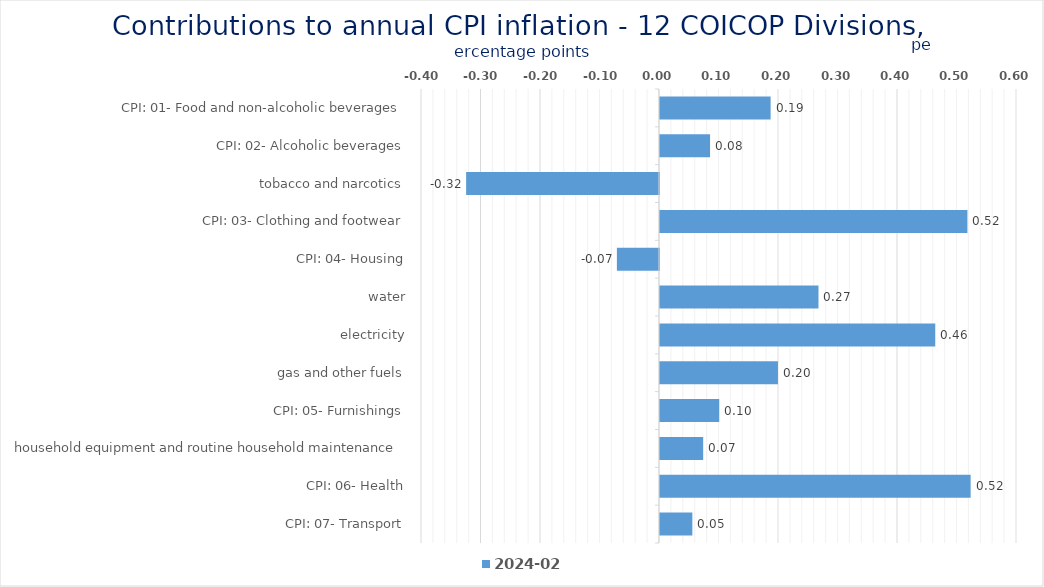
| Category | 2024-02 |
|---|---|
| CPI: 01- Food and non-alcoholic beverages | 0.186 |
| CPI: 02- Alcoholic beverages, tobacco and narcotics | 0.084 |
| CPI: 03- Clothing and footwear | -0.324 |
| CPI: 04- Housing, water, electricity, gas and other fuels | 0.517 |
| CPI: 05- Furnishings, household equipment and routine household maintenance | -0.071 |
| CPI: 06- Health | 0.266 |
| CPI: 07- Transport | 0.463 |
| CPI: 08- Communication | 0.198 |
| CPI: 09- Recreation and culture | 0.1 |
| CPI: 10- Education | 0.073 |
| CPI: 11- Restaurants and hotels | 0.522 |
| CPI: 12- Miscellaneous goods and services | 0.054 |